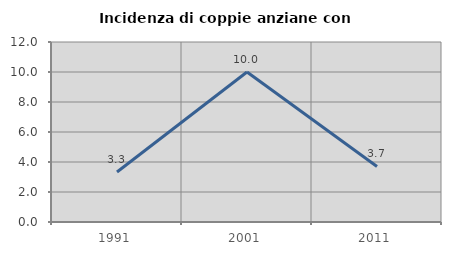
| Category | Incidenza di coppie anziane con figli |
|---|---|
| 1991.0 | 3.333 |
| 2001.0 | 10 |
| 2011.0 | 3.704 |